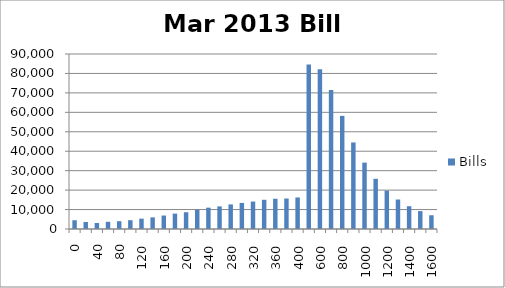
| Category | Bills |
|---|---|
| 0.0 | 4506.206 |
| 20.0 | 3590.616 |
| 40.0 | 3100.681 |
| 60.0 | 3716.444 |
| 80.0 | 4006.805 |
| 100.0 | 4529.679 |
| 120.0 | 5317.016 |
| 140.0 | 5984.366 |
| 160.0 | 6927.919 |
| 180.0 | 7918.412 |
| 200.0 | 8622.792 |
| 220.0 | 9941.47 |
| 240.0 | 10973.297 |
| 260.0 | 11624.682 |
| 280.0 | 12649.4 |
| 300.0 | 13420.386 |
| 320.0 | 14115.08 |
| 340.0 | 15019.831 |
| 360.0 | 15546.784 |
| 380.0 | 15688.178 |
| 400.0 | 16232.094 |
| 500.0 | 84548.109 |
| 600.0 | 82120.805 |
| 700.0 | 71480.951 |
| 800.0 | 58178.63 |
| 900.0 | 44513.586 |
| 1000.0 | 34142.129 |
| 1100.0 | 25819.921 |
| 1200.0 | 19758.263 |
| 1300.0 | 15163.816 |
| 1400.0 | 11721.802 |
| 1500.0 | 9203.088 |
| 1600.0 | 7075.055 |